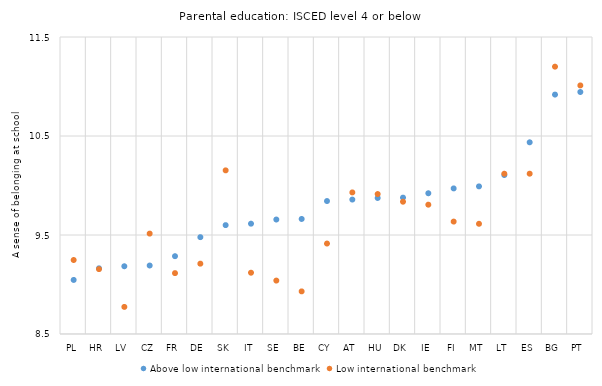
| Category | Above low international benchmark | Low international benchmark |
|---|---|---|
| PL | 9.046 | 9.247 |
| HR | 9.163 | 9.155 |
| LV | 9.184 | 8.774 |
| CZ | 9.192 | 9.514 |
| FR | 9.286 | 9.115 |
| DE | 9.478 | 9.211 |
| SK | 9.6 | 10.153 |
| IT | 9.614 | 9.119 |
| SE | 9.656 | 9.04 |
| BE | 9.662 | 8.931 |
| CY | 9.843 | 9.414 |
| AT | 9.858 | 9.93 |
| HU | 9.874 | 9.914 |
| DK | 9.878 | 9.836 |
| IE | 9.922 | 9.806 |
| FI | 9.971 | 9.636 |
| MT | 9.991 | 9.613 |
| LT | 10.106 | 10.119 |
| ES | 10.436 | 10.119 |
| BG | 10.919 | 11.2 |
| PT | 10.945 | 11.011 |